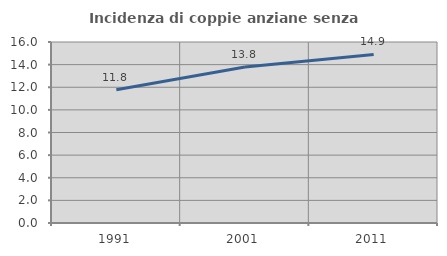
| Category | Incidenza di coppie anziane senza figli  |
|---|---|
| 1991.0 | 11.787 |
| 2001.0 | 13.782 |
| 2011.0 | 14.903 |